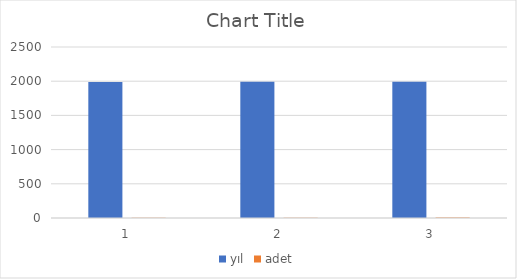
| Category | yıl | adet |
|---|---|---|
| 0 | 1990 | 2 |
| 1 | 1991 | 4 |
| 2 | 1992 | 8 |